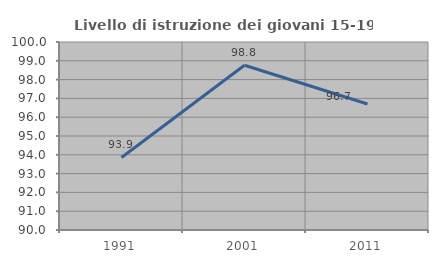
| Category | Livello di istruzione dei giovani 15-19 anni |
|---|---|
| 1991.0 | 93.86 |
| 2001.0 | 98.765 |
| 2011.0 | 96.703 |